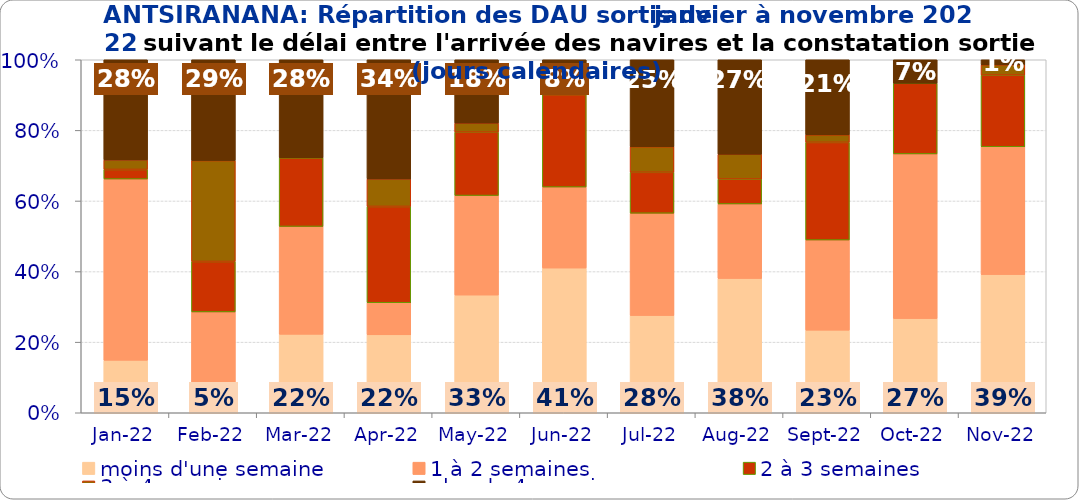
| Category | moins d'une semaine | 1 à 2 semaines | 2 à 3 semaines | 3 à 4 semaines | plus de 4 semaines |
|---|---|---|---|---|---|
| 2022-01-01 | 0.149 | 0.514 | 0.027 | 0.027 | 0.284 |
| 2022-02-01 | 0.048 | 0.238 | 0.143 | 0.286 | 0.286 |
| 2022-03-01 | 0.222 | 0.306 | 0.194 | 0 | 0.278 |
| 2022-04-01 | 0.221 | 0.091 | 0.273 | 0.078 | 0.338 |
| 2022-05-01 | 0.333 | 0.282 | 0.179 | 0.026 | 0.179 |
| 2022-06-01 | 0.41 | 0.23 | 0.262 | 0.016 | 0.082 |
| 2022-07-01 | 0.275 | 0.29 | 0.116 | 0.072 | 0.246 |
| 2022-08-01 | 0.38 | 0.211 | 0.07 | 0.07 | 0.268 |
| 2022-09-01 | 0.234 | 0.255 | 0.277 | 0.021 | 0.213 |
| 2022-10-01 | 0.267 | 0.467 | 0.2 | 0 | 0.067 |
| 2022-11-01 | 0.391 | 0.362 | 0.203 | 0.029 | 0.014 |